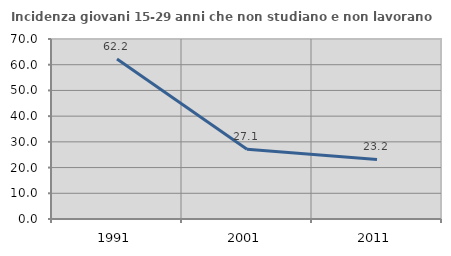
| Category | Incidenza giovani 15-29 anni che non studiano e non lavorano  |
|---|---|
| 1991.0 | 62.212 |
| 2001.0 | 27.136 |
| 2011.0 | 23.179 |